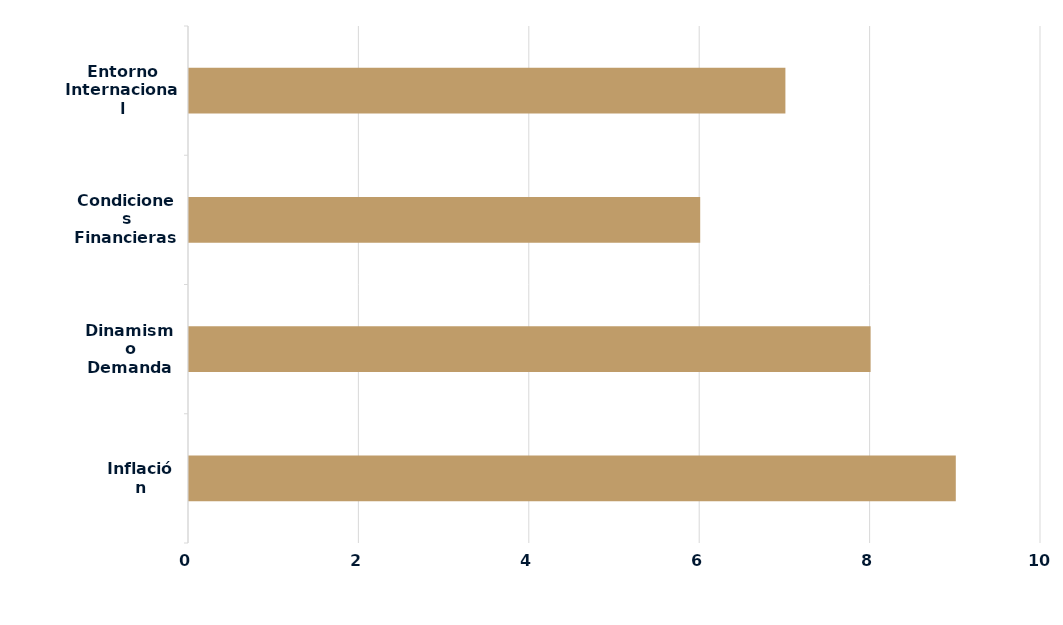
| Category | Series 0 |
|---|---|
| Inflación | 9 |
| Dinamismo Demanda | 8 |
| Condiciones Financieras Locales | 6 |
| Entorno Internacional | 7 |